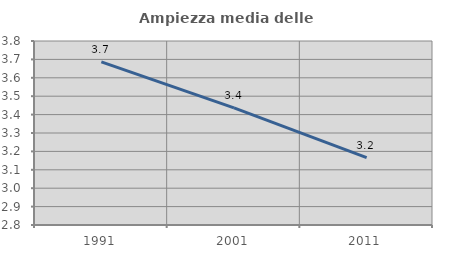
| Category | Ampiezza media delle famiglie |
|---|---|
| 1991.0 | 3.686 |
| 2001.0 | 3.436 |
| 2011.0 | 3.166 |